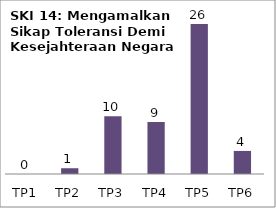
| Category | Bil Pel |
|---|---|
| TP1 | 0 |
| TP2 | 1 |
| TP3 | 10 |
| TP4 | 9 |
| TP5 | 26 |
| TP6 | 4 |